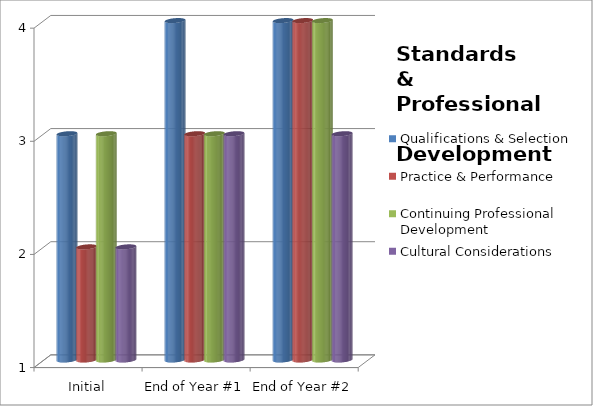
| Category | Qualifications & Selection  | Practice & Performance  | Continuing Professional Development  | Cultural Considerations  |
|---|---|---|---|---|
| Initial | 3 | 2 | 3 | 2 |
| End of Year #1 | 4 | 3 | 3 | 3 |
| End of Year #2 | 4 | 4 | 4 | 3 |